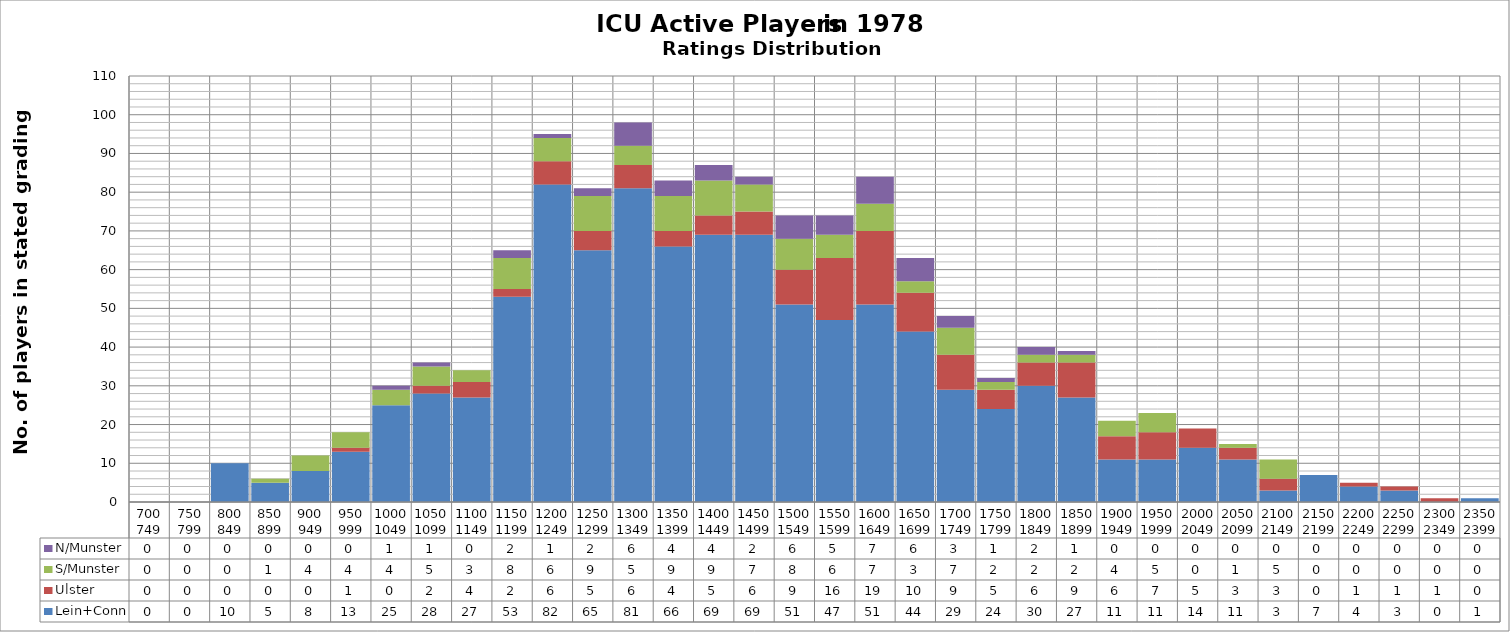
| Category | Lein+Conn | Ulster | S/Munster | N/Munster |
|---|---|---|---|---|
|  700  749 | 0 | 0 | 0 | 0 |
|  750  799 | 0 | 0 | 0 | 0 |
|  800  849 | 10 | 0 | 0 | 0 |
|  850  899 | 5 | 0 | 1 | 0 |
|  900  949 | 8 | 0 | 4 | 0 |
|  950  999 | 13 | 1 | 4 | 0 |
| 1000 1049 | 25 | 0 | 4 | 1 |
| 1050 1099 | 28 | 2 | 5 | 1 |
| 1100 1149 | 27 | 4 | 3 | 0 |
| 1150 1199 | 53 | 2 | 8 | 2 |
| 1200 1249 | 82 | 6 | 6 | 1 |
| 1250 1299 | 65 | 5 | 9 | 2 |
| 1300 1349 | 81 | 6 | 5 | 6 |
| 1350 1399 | 66 | 4 | 9 | 4 |
| 1400 1449 | 69 | 5 | 9 | 4 |
| 1450 1499 | 69 | 6 | 7 | 2 |
| 1500 1549 | 51 | 9 | 8 | 6 |
| 1550 1599 | 47 | 16 | 6 | 5 |
| 1600 1649 | 51 | 19 | 7 | 7 |
| 1650 1699 | 44 | 10 | 3 | 6 |
| 1700 1749 | 29 | 9 | 7 | 3 |
| 1750 1799 | 24 | 5 | 2 | 1 |
| 1800 1849 | 30 | 6 | 2 | 2 |
| 1850 1899 | 27 | 9 | 2 | 1 |
| 1900 1949 | 11 | 6 | 4 | 0 |
| 1950 1999 | 11 | 7 | 5 | 0 |
| 2000 2049 | 14 | 5 | 0 | 0 |
| 2050 2099 | 11 | 3 | 1 | 0 |
| 2100 2149 | 3 | 3 | 5 | 0 |
| 2150 2199 | 7 | 0 | 0 | 0 |
| 2200 2249 | 4 | 1 | 0 | 0 |
| 2250 2299 | 3 | 1 | 0 | 0 |
| 2300 2349 | 0 | 1 | 0 | 0 |
| 2350 2399 | 1 | 0 | 0 | 0 |